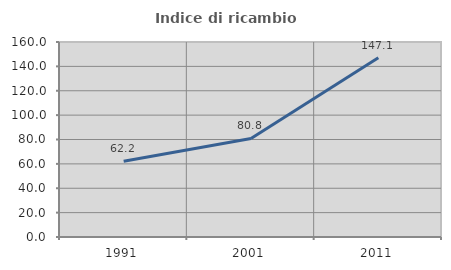
| Category | Indice di ricambio occupazionale  |
|---|---|
| 1991.0 | 62.179 |
| 2001.0 | 80.838 |
| 2011.0 | 147.087 |